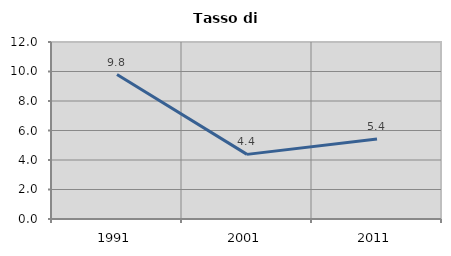
| Category | Tasso di disoccupazione   |
|---|---|
| 1991.0 | 9.79 |
| 2001.0 | 4.381 |
| 2011.0 | 5.423 |